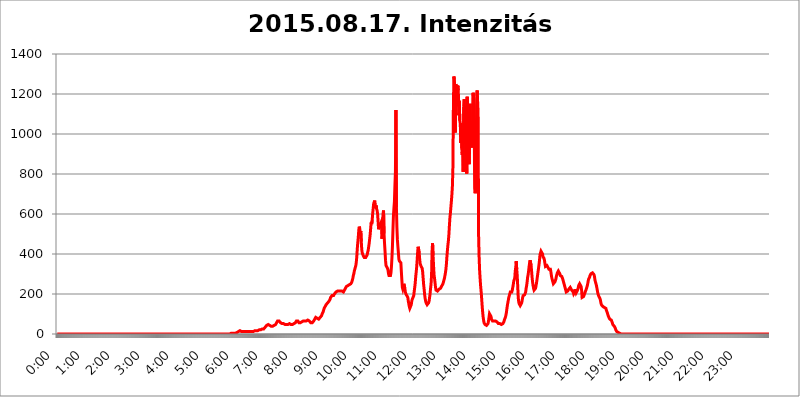
| Category | 2015.08.17. Intenzitás [W/m^2] |
|---|---|
| 0.0 | 0 |
| 0.0006944444444444445 | 0 |
| 0.001388888888888889 | 0 |
| 0.0020833333333333333 | 0 |
| 0.002777777777777778 | 0 |
| 0.003472222222222222 | 0 |
| 0.004166666666666667 | 0 |
| 0.004861111111111111 | 0 |
| 0.005555555555555556 | 0 |
| 0.0062499999999999995 | 0 |
| 0.006944444444444444 | 0 |
| 0.007638888888888889 | 0 |
| 0.008333333333333333 | 0 |
| 0.009027777777777779 | 0 |
| 0.009722222222222222 | 0 |
| 0.010416666666666666 | 0 |
| 0.011111111111111112 | 0 |
| 0.011805555555555555 | 0 |
| 0.012499999999999999 | 0 |
| 0.013194444444444444 | 0 |
| 0.013888888888888888 | 0 |
| 0.014583333333333332 | 0 |
| 0.015277777777777777 | 0 |
| 0.015972222222222224 | 0 |
| 0.016666666666666666 | 0 |
| 0.017361111111111112 | 0 |
| 0.018055555555555557 | 0 |
| 0.01875 | 0 |
| 0.019444444444444445 | 0 |
| 0.02013888888888889 | 0 |
| 0.020833333333333332 | 0 |
| 0.02152777777777778 | 0 |
| 0.022222222222222223 | 0 |
| 0.02291666666666667 | 0 |
| 0.02361111111111111 | 0 |
| 0.024305555555555556 | 0 |
| 0.024999999999999998 | 0 |
| 0.025694444444444447 | 0 |
| 0.02638888888888889 | 0 |
| 0.027083333333333334 | 0 |
| 0.027777777777777776 | 0 |
| 0.02847222222222222 | 0 |
| 0.029166666666666664 | 0 |
| 0.029861111111111113 | 0 |
| 0.030555555555555555 | 0 |
| 0.03125 | 0 |
| 0.03194444444444445 | 0 |
| 0.03263888888888889 | 0 |
| 0.03333333333333333 | 0 |
| 0.034027777777777775 | 0 |
| 0.034722222222222224 | 0 |
| 0.035416666666666666 | 0 |
| 0.036111111111111115 | 0 |
| 0.03680555555555556 | 0 |
| 0.0375 | 0 |
| 0.03819444444444444 | 0 |
| 0.03888888888888889 | 0 |
| 0.03958333333333333 | 0 |
| 0.04027777777777778 | 0 |
| 0.04097222222222222 | 0 |
| 0.041666666666666664 | 0 |
| 0.042361111111111106 | 0 |
| 0.04305555555555556 | 0 |
| 0.043750000000000004 | 0 |
| 0.044444444444444446 | 0 |
| 0.04513888888888889 | 0 |
| 0.04583333333333334 | 0 |
| 0.04652777777777778 | 0 |
| 0.04722222222222222 | 0 |
| 0.04791666666666666 | 0 |
| 0.04861111111111111 | 0 |
| 0.049305555555555554 | 0 |
| 0.049999999999999996 | 0 |
| 0.05069444444444445 | 0 |
| 0.051388888888888894 | 0 |
| 0.052083333333333336 | 0 |
| 0.05277777777777778 | 0 |
| 0.05347222222222222 | 0 |
| 0.05416666666666667 | 0 |
| 0.05486111111111111 | 0 |
| 0.05555555555555555 | 0 |
| 0.05625 | 0 |
| 0.05694444444444444 | 0 |
| 0.057638888888888885 | 0 |
| 0.05833333333333333 | 0 |
| 0.05902777777777778 | 0 |
| 0.059722222222222225 | 0 |
| 0.06041666666666667 | 0 |
| 0.061111111111111116 | 0 |
| 0.06180555555555556 | 0 |
| 0.0625 | 0 |
| 0.06319444444444444 | 0 |
| 0.06388888888888888 | 0 |
| 0.06458333333333334 | 0 |
| 0.06527777777777778 | 0 |
| 0.06597222222222222 | 0 |
| 0.06666666666666667 | 0 |
| 0.06736111111111111 | 0 |
| 0.06805555555555555 | 0 |
| 0.06874999999999999 | 0 |
| 0.06944444444444443 | 0 |
| 0.07013888888888889 | 0 |
| 0.07083333333333333 | 0 |
| 0.07152777777777779 | 0 |
| 0.07222222222222223 | 0 |
| 0.07291666666666667 | 0 |
| 0.07361111111111111 | 0 |
| 0.07430555555555556 | 0 |
| 0.075 | 0 |
| 0.07569444444444444 | 0 |
| 0.0763888888888889 | 0 |
| 0.07708333333333334 | 0 |
| 0.07777777777777778 | 0 |
| 0.07847222222222222 | 0 |
| 0.07916666666666666 | 0 |
| 0.0798611111111111 | 0 |
| 0.08055555555555556 | 0 |
| 0.08125 | 0 |
| 0.08194444444444444 | 0 |
| 0.08263888888888889 | 0 |
| 0.08333333333333333 | 0 |
| 0.08402777777777777 | 0 |
| 0.08472222222222221 | 0 |
| 0.08541666666666665 | 0 |
| 0.08611111111111112 | 0 |
| 0.08680555555555557 | 0 |
| 0.08750000000000001 | 0 |
| 0.08819444444444445 | 0 |
| 0.08888888888888889 | 0 |
| 0.08958333333333333 | 0 |
| 0.09027777777777778 | 0 |
| 0.09097222222222222 | 0 |
| 0.09166666666666667 | 0 |
| 0.09236111111111112 | 0 |
| 0.09305555555555556 | 0 |
| 0.09375 | 0 |
| 0.09444444444444444 | 0 |
| 0.09513888888888888 | 0 |
| 0.09583333333333333 | 0 |
| 0.09652777777777777 | 0 |
| 0.09722222222222222 | 0 |
| 0.09791666666666667 | 0 |
| 0.09861111111111111 | 0 |
| 0.09930555555555555 | 0 |
| 0.09999999999999999 | 0 |
| 0.10069444444444443 | 0 |
| 0.1013888888888889 | 0 |
| 0.10208333333333335 | 0 |
| 0.10277777777777779 | 0 |
| 0.10347222222222223 | 0 |
| 0.10416666666666667 | 0 |
| 0.10486111111111111 | 0 |
| 0.10555555555555556 | 0 |
| 0.10625 | 0 |
| 0.10694444444444444 | 0 |
| 0.1076388888888889 | 0 |
| 0.10833333333333334 | 0 |
| 0.10902777777777778 | 0 |
| 0.10972222222222222 | 0 |
| 0.1111111111111111 | 0 |
| 0.11180555555555556 | 0 |
| 0.11180555555555556 | 0 |
| 0.1125 | 0 |
| 0.11319444444444444 | 0 |
| 0.11388888888888889 | 0 |
| 0.11458333333333333 | 0 |
| 0.11527777777777777 | 0 |
| 0.11597222222222221 | 0 |
| 0.11666666666666665 | 0 |
| 0.1173611111111111 | 0 |
| 0.11805555555555557 | 0 |
| 0.11944444444444445 | 0 |
| 0.12013888888888889 | 0 |
| 0.12083333333333333 | 0 |
| 0.12152777777777778 | 0 |
| 0.12222222222222223 | 0 |
| 0.12291666666666667 | 0 |
| 0.12291666666666667 | 0 |
| 0.12361111111111112 | 0 |
| 0.12430555555555556 | 0 |
| 0.125 | 0 |
| 0.12569444444444444 | 0 |
| 0.12638888888888888 | 0 |
| 0.12708333333333333 | 0 |
| 0.16875 | 0 |
| 0.12847222222222224 | 0 |
| 0.12916666666666668 | 0 |
| 0.12986111111111112 | 0 |
| 0.13055555555555556 | 0 |
| 0.13125 | 0 |
| 0.13194444444444445 | 0 |
| 0.1326388888888889 | 0 |
| 0.13333333333333333 | 0 |
| 0.13402777777777777 | 0 |
| 0.13402777777777777 | 0 |
| 0.13472222222222222 | 0 |
| 0.13541666666666666 | 0 |
| 0.1361111111111111 | 0 |
| 0.13749999999999998 | 0 |
| 0.13819444444444443 | 0 |
| 0.1388888888888889 | 0 |
| 0.13958333333333334 | 0 |
| 0.14027777777777778 | 0 |
| 0.14097222222222222 | 0 |
| 0.14166666666666666 | 0 |
| 0.1423611111111111 | 0 |
| 0.14305555555555557 | 0 |
| 0.14375000000000002 | 0 |
| 0.14444444444444446 | 0 |
| 0.1451388888888889 | 0 |
| 0.1451388888888889 | 0 |
| 0.14652777777777778 | 0 |
| 0.14722222222222223 | 0 |
| 0.14791666666666667 | 0 |
| 0.1486111111111111 | 0 |
| 0.14930555555555555 | 0 |
| 0.15 | 0 |
| 0.15069444444444444 | 0 |
| 0.15138888888888888 | 0 |
| 0.15208333333333332 | 0 |
| 0.15277777777777776 | 0 |
| 0.15347222222222223 | 0 |
| 0.15416666666666667 | 0 |
| 0.15486111111111112 | 0 |
| 0.15555555555555556 | 0 |
| 0.15625 | 0 |
| 0.15694444444444444 | 0 |
| 0.15763888888888888 | 0 |
| 0.15833333333333333 | 0 |
| 0.15902777777777777 | 0 |
| 0.15972222222222224 | 0 |
| 0.16041666666666668 | 0 |
| 0.16111111111111112 | 0 |
| 0.16180555555555556 | 0 |
| 0.1625 | 0 |
| 0.16319444444444445 | 0 |
| 0.1638888888888889 | 0 |
| 0.16458333333333333 | 0 |
| 0.16527777777777777 | 0 |
| 0.16597222222222222 | 0 |
| 0.16666666666666666 | 0 |
| 0.1673611111111111 | 0 |
| 0.16805555555555554 | 0 |
| 0.16874999999999998 | 0 |
| 0.16944444444444443 | 0 |
| 0.17013888888888887 | 0 |
| 0.1708333333333333 | 0 |
| 0.17152777777777775 | 0 |
| 0.17222222222222225 | 0 |
| 0.1729166666666667 | 0 |
| 0.17361111111111113 | 0 |
| 0.17430555555555557 | 0 |
| 0.17500000000000002 | 0 |
| 0.17569444444444446 | 0 |
| 0.1763888888888889 | 0 |
| 0.17708333333333334 | 0 |
| 0.17777777777777778 | 0 |
| 0.17847222222222223 | 0 |
| 0.17916666666666667 | 0 |
| 0.1798611111111111 | 0 |
| 0.18055555555555555 | 0 |
| 0.18125 | 0 |
| 0.18194444444444444 | 0 |
| 0.1826388888888889 | 0 |
| 0.18333333333333335 | 0 |
| 0.1840277777777778 | 0 |
| 0.18472222222222223 | 0 |
| 0.18541666666666667 | 0 |
| 0.18611111111111112 | 0 |
| 0.18680555555555556 | 0 |
| 0.1875 | 0 |
| 0.18819444444444444 | 0 |
| 0.18888888888888888 | 0 |
| 0.18958333333333333 | 0 |
| 0.19027777777777777 | 0 |
| 0.1909722222222222 | 0 |
| 0.19166666666666665 | 0 |
| 0.19236111111111112 | 0 |
| 0.19305555555555554 | 0 |
| 0.19375 | 0 |
| 0.19444444444444445 | 0 |
| 0.1951388888888889 | 0 |
| 0.19583333333333333 | 0 |
| 0.19652777777777777 | 0 |
| 0.19722222222222222 | 0 |
| 0.19791666666666666 | 0 |
| 0.1986111111111111 | 0 |
| 0.19930555555555554 | 0 |
| 0.19999999999999998 | 0 |
| 0.20069444444444443 | 0 |
| 0.20138888888888887 | 0 |
| 0.2020833333333333 | 0 |
| 0.2027777777777778 | 0 |
| 0.2034722222222222 | 0 |
| 0.2041666666666667 | 0 |
| 0.20486111111111113 | 0 |
| 0.20555555555555557 | 0 |
| 0.20625000000000002 | 0 |
| 0.20694444444444446 | 0 |
| 0.2076388888888889 | 0 |
| 0.20833333333333334 | 0 |
| 0.20902777777777778 | 0 |
| 0.20972222222222223 | 0 |
| 0.21041666666666667 | 0 |
| 0.2111111111111111 | 0 |
| 0.21180555555555555 | 0 |
| 0.2125 | 0 |
| 0.21319444444444444 | 0 |
| 0.2138888888888889 | 0 |
| 0.21458333333333335 | 0 |
| 0.2152777777777778 | 0 |
| 0.21597222222222223 | 0 |
| 0.21666666666666667 | 0 |
| 0.21736111111111112 | 0 |
| 0.21805555555555556 | 0 |
| 0.21875 | 0 |
| 0.21944444444444444 | 0 |
| 0.22013888888888888 | 0 |
| 0.22083333333333333 | 0 |
| 0.22152777777777777 | 0 |
| 0.2222222222222222 | 0 |
| 0.22291666666666665 | 0 |
| 0.2236111111111111 | 0 |
| 0.22430555555555556 | 0 |
| 0.225 | 0 |
| 0.22569444444444445 | 0 |
| 0.2263888888888889 | 0 |
| 0.22708333333333333 | 0 |
| 0.22777777777777777 | 0 |
| 0.22847222222222222 | 0 |
| 0.22916666666666666 | 0 |
| 0.2298611111111111 | 0 |
| 0.23055555555555554 | 0 |
| 0.23124999999999998 | 0 |
| 0.23194444444444443 | 0 |
| 0.23263888888888887 | 0 |
| 0.2333333333333333 | 0 |
| 0.2340277777777778 | 0 |
| 0.2347222222222222 | 0 |
| 0.2354166666666667 | 0 |
| 0.23611111111111113 | 0 |
| 0.23680555555555557 | 0 |
| 0.23750000000000002 | 0 |
| 0.23819444444444446 | 0 |
| 0.2388888888888889 | 0 |
| 0.23958333333333334 | 0 |
| 0.24027777777777778 | 0 |
| 0.24097222222222223 | 0 |
| 0.24166666666666667 | 0 |
| 0.2423611111111111 | 3.525 |
| 0.24305555555555555 | 3.525 |
| 0.24375 | 3.525 |
| 0.24444444444444446 | 3.525 |
| 0.24513888888888888 | 3.525 |
| 0.24583333333333335 | 3.525 |
| 0.2465277777777778 | 3.525 |
| 0.24722222222222223 | 3.525 |
| 0.24791666666666667 | 3.525 |
| 0.24861111111111112 | 7.887 |
| 0.24930555555555556 | 3.525 |
| 0.25 | 3.525 |
| 0.25069444444444444 | 7.887 |
| 0.2513888888888889 | 7.887 |
| 0.2520833333333333 | 7.887 |
| 0.25277777777777777 | 12.257 |
| 0.2534722222222222 | 12.257 |
| 0.25416666666666665 | 12.257 |
| 0.2548611111111111 | 12.257 |
| 0.2555555555555556 | 16.636 |
| 0.25625000000000003 | 16.636 |
| 0.2569444444444445 | 16.636 |
| 0.2576388888888889 | 12.257 |
| 0.25833333333333336 | 12.257 |
| 0.2590277777777778 | 12.257 |
| 0.25972222222222224 | 12.257 |
| 0.2604166666666667 | 12.257 |
| 0.2611111111111111 | 12.257 |
| 0.26180555555555557 | 12.257 |
| 0.2625 | 12.257 |
| 0.26319444444444445 | 12.257 |
| 0.2638888888888889 | 12.257 |
| 0.26458333333333334 | 12.257 |
| 0.2652777777777778 | 12.257 |
| 0.2659722222222222 | 12.257 |
| 0.26666666666666666 | 12.257 |
| 0.2673611111111111 | 12.257 |
| 0.26805555555555555 | 12.257 |
| 0.26875 | 12.257 |
| 0.26944444444444443 | 12.257 |
| 0.2701388888888889 | 12.257 |
| 0.2708333333333333 | 12.257 |
| 0.27152777777777776 | 12.257 |
| 0.2722222222222222 | 12.257 |
| 0.27291666666666664 | 12.257 |
| 0.2736111111111111 | 12.257 |
| 0.2743055555555555 | 12.257 |
| 0.27499999999999997 | 12.257 |
| 0.27569444444444446 | 12.257 |
| 0.27638888888888885 | 12.257 |
| 0.27708333333333335 | 16.636 |
| 0.2777777777777778 | 16.636 |
| 0.27847222222222223 | 16.636 |
| 0.2791666666666667 | 16.636 |
| 0.2798611111111111 | 16.636 |
| 0.28055555555555556 | 16.636 |
| 0.28125 | 16.636 |
| 0.28194444444444444 | 16.636 |
| 0.2826388888888889 | 16.636 |
| 0.2833333333333333 | 21.024 |
| 0.28402777777777777 | 21.024 |
| 0.2847222222222222 | 21.024 |
| 0.28541666666666665 | 21.024 |
| 0.28611111111111115 | 21.024 |
| 0.28680555555555554 | 21.024 |
| 0.28750000000000003 | 25.419 |
| 0.2881944444444445 | 25.419 |
| 0.2888888888888889 | 25.419 |
| 0.28958333333333336 | 25.419 |
| 0.2902777777777778 | 29.823 |
| 0.29097222222222224 | 29.823 |
| 0.2916666666666667 | 34.234 |
| 0.2923611111111111 | 38.653 |
| 0.29305555555555557 | 38.653 |
| 0.29375 | 43.079 |
| 0.29444444444444445 | 43.079 |
| 0.2951388888888889 | 47.511 |
| 0.29583333333333334 | 47.511 |
| 0.2965277777777778 | 47.511 |
| 0.2972222222222222 | 43.079 |
| 0.29791666666666666 | 43.079 |
| 0.2986111111111111 | 43.079 |
| 0.29930555555555555 | 43.079 |
| 0.3 | 38.653 |
| 0.30069444444444443 | 38.653 |
| 0.3013888888888889 | 43.079 |
| 0.3020833333333333 | 38.653 |
| 0.30277777777777776 | 43.079 |
| 0.3034722222222222 | 43.079 |
| 0.30416666666666664 | 43.079 |
| 0.3048611111111111 | 43.079 |
| 0.3055555555555555 | 47.511 |
| 0.30624999999999997 | 47.511 |
| 0.3069444444444444 | 51.951 |
| 0.3076388888888889 | 56.398 |
| 0.30833333333333335 | 60.85 |
| 0.3090277777777778 | 65.31 |
| 0.30972222222222223 | 65.31 |
| 0.3104166666666667 | 65.31 |
| 0.3111111111111111 | 65.31 |
| 0.31180555555555556 | 65.31 |
| 0.3125 | 65.31 |
| 0.31319444444444444 | 56.398 |
| 0.3138888888888889 | 56.398 |
| 0.3145833333333333 | 56.398 |
| 0.31527777777777777 | 51.951 |
| 0.3159722222222222 | 51.951 |
| 0.31666666666666665 | 51.951 |
| 0.31736111111111115 | 51.951 |
| 0.31805555555555554 | 51.951 |
| 0.31875000000000003 | 47.511 |
| 0.3194444444444445 | 47.511 |
| 0.3201388888888889 | 47.511 |
| 0.32083333333333336 | 47.511 |
| 0.3215277777777778 | 47.511 |
| 0.32222222222222224 | 47.511 |
| 0.3229166666666667 | 47.511 |
| 0.3236111111111111 | 47.511 |
| 0.32430555555555557 | 47.511 |
| 0.325 | 47.511 |
| 0.32569444444444445 | 51.951 |
| 0.3263888888888889 | 47.511 |
| 0.32708333333333334 | 47.511 |
| 0.3277777777777778 | 47.511 |
| 0.3284722222222222 | 47.511 |
| 0.32916666666666666 | 47.511 |
| 0.3298611111111111 | 47.511 |
| 0.33055555555555555 | 47.511 |
| 0.33125 | 51.951 |
| 0.33194444444444443 | 51.951 |
| 0.3326388888888889 | 51.951 |
| 0.3333333333333333 | 56.398 |
| 0.3340277777777778 | 56.398 |
| 0.3347222222222222 | 60.85 |
| 0.3354166666666667 | 65.31 |
| 0.3361111111111111 | 65.31 |
| 0.3368055555555556 | 65.31 |
| 0.33749999999999997 | 65.31 |
| 0.33819444444444446 | 60.85 |
| 0.33888888888888885 | 56.398 |
| 0.33958333333333335 | 56.398 |
| 0.34027777777777773 | 51.951 |
| 0.34097222222222223 | 56.398 |
| 0.3416666666666666 | 56.398 |
| 0.3423611111111111 | 56.398 |
| 0.3430555555555555 | 60.85 |
| 0.34375 | 60.85 |
| 0.3444444444444445 | 65.31 |
| 0.3451388888888889 | 65.31 |
| 0.3458333333333334 | 65.31 |
| 0.34652777777777777 | 65.31 |
| 0.34722222222222227 | 65.31 |
| 0.34791666666666665 | 65.31 |
| 0.34861111111111115 | 65.31 |
| 0.34930555555555554 | 65.31 |
| 0.35000000000000003 | 69.775 |
| 0.3506944444444444 | 69.775 |
| 0.3513888888888889 | 69.775 |
| 0.3520833333333333 | 69.775 |
| 0.3527777777777778 | 65.31 |
| 0.3534722222222222 | 65.31 |
| 0.3541666666666667 | 65.31 |
| 0.3548611111111111 | 60.85 |
| 0.35555555555555557 | 56.398 |
| 0.35625 | 56.398 |
| 0.35694444444444445 | 56.398 |
| 0.3576388888888889 | 56.398 |
| 0.35833333333333334 | 56.398 |
| 0.3590277777777778 | 60.85 |
| 0.3597222222222222 | 65.31 |
| 0.36041666666666666 | 65.31 |
| 0.3611111111111111 | 74.246 |
| 0.36180555555555555 | 78.722 |
| 0.3625 | 83.205 |
| 0.36319444444444443 | 83.205 |
| 0.3638888888888889 | 78.722 |
| 0.3645833333333333 | 78.722 |
| 0.3652777777777778 | 74.246 |
| 0.3659722222222222 | 74.246 |
| 0.3666666666666667 | 74.246 |
| 0.3673611111111111 | 74.246 |
| 0.3680555555555556 | 78.722 |
| 0.36874999999999997 | 83.205 |
| 0.36944444444444446 | 87.692 |
| 0.37013888888888885 | 87.692 |
| 0.37083333333333335 | 92.184 |
| 0.37152777777777773 | 101.184 |
| 0.37222222222222223 | 105.69 |
| 0.3729166666666666 | 110.201 |
| 0.3736111111111111 | 119.235 |
| 0.3743055555555555 | 128.284 |
| 0.375 | 132.814 |
| 0.3756944444444445 | 137.347 |
| 0.3763888888888889 | 141.884 |
| 0.3770833333333334 | 146.423 |
| 0.37777777777777777 | 150.964 |
| 0.37847222222222227 | 150.964 |
| 0.37916666666666665 | 155.509 |
| 0.37986111111111115 | 155.509 |
| 0.38055555555555554 | 160.056 |
| 0.38125000000000003 | 164.605 |
| 0.3819444444444444 | 169.156 |
| 0.3826388888888889 | 173.709 |
| 0.3833333333333333 | 182.82 |
| 0.3840277777777778 | 182.82 |
| 0.3847222222222222 | 187.378 |
| 0.3854166666666667 | 191.937 |
| 0.3861111111111111 | 191.937 |
| 0.38680555555555557 | 191.937 |
| 0.3875 | 191.937 |
| 0.38819444444444445 | 196.497 |
| 0.3888888888888889 | 201.058 |
| 0.38958333333333334 | 201.058 |
| 0.3902777777777778 | 205.62 |
| 0.3909722222222222 | 210.182 |
| 0.39166666666666666 | 210.182 |
| 0.3923611111111111 | 214.746 |
| 0.39305555555555555 | 214.746 |
| 0.39375 | 219.309 |
| 0.39444444444444443 | 219.309 |
| 0.3951388888888889 | 214.746 |
| 0.3958333333333333 | 214.746 |
| 0.3965277777777778 | 214.746 |
| 0.3972222222222222 | 214.746 |
| 0.3979166666666667 | 214.746 |
| 0.3986111111111111 | 214.746 |
| 0.3993055555555556 | 214.746 |
| 0.39999999999999997 | 210.182 |
| 0.40069444444444446 | 210.182 |
| 0.40138888888888885 | 210.182 |
| 0.40208333333333335 | 214.746 |
| 0.40277777777777773 | 219.309 |
| 0.40347222222222223 | 223.873 |
| 0.4041666666666666 | 228.436 |
| 0.4048611111111111 | 233 |
| 0.4055555555555555 | 237.564 |
| 0.40625 | 242.127 |
| 0.4069444444444445 | 242.127 |
| 0.4076388888888889 | 242.127 |
| 0.4083333333333334 | 246.689 |
| 0.40902777777777777 | 246.689 |
| 0.40972222222222227 | 246.689 |
| 0.41041666666666665 | 246.689 |
| 0.41111111111111115 | 251.251 |
| 0.41180555555555554 | 251.251 |
| 0.41250000000000003 | 255.813 |
| 0.4131944444444444 | 260.373 |
| 0.4138888888888889 | 269.49 |
| 0.4145833333333333 | 278.603 |
| 0.4152777777777778 | 292.259 |
| 0.4159722222222222 | 301.354 |
| 0.4166666666666667 | 314.98 |
| 0.4173611111111111 | 324.052 |
| 0.41805555555555557 | 333.113 |
| 0.41875 | 342.162 |
| 0.41944444444444445 | 360.221 |
| 0.4201388888888889 | 387.202 |
| 0.42083333333333334 | 427.39 |
| 0.4215277777777778 | 458.38 |
| 0.4222222222222222 | 484.735 |
| 0.42291666666666666 | 519.555 |
| 0.4236111111111111 | 536.82 |
| 0.42430555555555555 | 528.2 |
| 0.425 | 497.836 |
| 0.42569444444444443 | 515.223 |
| 0.4263888888888889 | 462.786 |
| 0.4270833333333333 | 422.943 |
| 0.4277777777777778 | 405.108 |
| 0.4284722222222222 | 400.638 |
| 0.4291666666666667 | 391.685 |
| 0.4298611111111111 | 387.202 |
| 0.4305555555555556 | 382.715 |
| 0.43124999999999997 | 382.715 |
| 0.43194444444444446 | 378.224 |
| 0.43263888888888885 | 382.715 |
| 0.43333333333333335 | 382.715 |
| 0.43402777777777773 | 387.202 |
| 0.43472222222222223 | 396.164 |
| 0.4354166666666666 | 409.574 |
| 0.4361111111111111 | 418.492 |
| 0.4368055555555555 | 436.27 |
| 0.4375 | 453.968 |
| 0.4381944444444445 | 475.972 |
| 0.4388888888888889 | 497.836 |
| 0.4395833333333334 | 528.2 |
| 0.44027777777777777 | 558.261 |
| 0.44097222222222227 | 549.704 |
| 0.44166666666666665 | 566.793 |
| 0.44236111111111115 | 600.661 |
| 0.44305555555555554 | 625.784 |
| 0.44375000000000003 | 650.667 |
| 0.4444444444444444 | 650.667 |
| 0.4451388888888889 | 667.123 |
| 0.4458333333333333 | 642.4 |
| 0.4465277777777778 | 629.948 |
| 0.4472222222222222 | 642.4 |
| 0.4479166666666667 | 625.784 |
| 0.4486111111111111 | 617.436 |
| 0.44930555555555557 | 600.661 |
| 0.45 | 562.53 |
| 0.45069444444444445 | 523.88 |
| 0.4513888888888889 | 549.704 |
| 0.45208333333333334 | 541.121 |
| 0.4527777777777778 | 536.82 |
| 0.4534722222222222 | 545.416 |
| 0.45416666666666666 | 558.261 |
| 0.4548611111111111 | 541.121 |
| 0.45555555555555555 | 475.972 |
| 0.45625 | 558.261 |
| 0.45694444444444443 | 600.661 |
| 0.4576388888888889 | 617.436 |
| 0.4583333333333333 | 502.192 |
| 0.4590277777777778 | 453.968 |
| 0.4597222222222222 | 414.035 |
| 0.4604166666666667 | 369.23 |
| 0.4611111111111111 | 342.162 |
| 0.4618055555555556 | 342.162 |
| 0.46249999999999997 | 342.162 |
| 0.46319444444444446 | 328.584 |
| 0.46388888888888885 | 319.517 |
| 0.46458333333333335 | 301.354 |
| 0.46527777777777773 | 292.259 |
| 0.46597222222222223 | 287.709 |
| 0.4666666666666666 | 287.709 |
| 0.4673611111111111 | 292.259 |
| 0.4680555555555555 | 305.898 |
| 0.46875 | 337.639 |
| 0.4694444444444445 | 382.715 |
| 0.4701388888888889 | 440.702 |
| 0.4708333333333334 | 519.555 |
| 0.47152777777777777 | 592.233 |
| 0.47222222222222227 | 629.948 |
| 0.47291666666666665 | 663.019 |
| 0.47361111111111115 | 743.859 |
| 0.47430555555555554 | 810.641 |
| 0.47500000000000003 | 1120.238 |
| 0.4756944444444444 | 634.105 |
| 0.4763888888888889 | 532.513 |
| 0.4770833333333333 | 471.582 |
| 0.4777777777777778 | 436.27 |
| 0.4784722222222222 | 405.108 |
| 0.4791666666666667 | 373.729 |
| 0.4798611111111111 | 364.728 |
| 0.48055555555555557 | 369.23 |
| 0.48125 | 364.728 |
| 0.48194444444444445 | 355.712 |
| 0.4826388888888889 | 310.44 |
| 0.48333333333333334 | 269.49 |
| 0.4840277777777778 | 233 |
| 0.4847222222222222 | 223.873 |
| 0.48541666666666666 | 233 |
| 0.4861111111111111 | 251.251 |
| 0.48680555555555555 | 246.689 |
| 0.4875 | 228.436 |
| 0.48819444444444443 | 210.182 |
| 0.4888888888888889 | 201.058 |
| 0.4895833333333333 | 196.497 |
| 0.4902777777777778 | 191.937 |
| 0.4909722222222222 | 191.937 |
| 0.4916666666666667 | 182.82 |
| 0.4923611111111111 | 164.605 |
| 0.4930555555555556 | 150.964 |
| 0.49374999999999997 | 137.347 |
| 0.49444444444444446 | 128.284 |
| 0.49513888888888885 | 128.284 |
| 0.49583333333333335 | 132.814 |
| 0.49652777777777773 | 146.423 |
| 0.49722222222222223 | 164.605 |
| 0.4979166666666666 | 173.709 |
| 0.4986111111111111 | 173.709 |
| 0.4993055555555555 | 178.264 |
| 0.5 | 191.937 |
| 0.5006944444444444 | 214.746 |
| 0.5013888888888889 | 233 |
| 0.5020833333333333 | 255.813 |
| 0.5027777777777778 | 287.709 |
| 0.5034722222222222 | 310.44 |
| 0.5041666666666667 | 337.639 |
| 0.5048611111111111 | 373.729 |
| 0.5055555555555555 | 414.035 |
| 0.50625 | 436.27 |
| 0.5069444444444444 | 431.833 |
| 0.5076388888888889 | 405.108 |
| 0.5083333333333333 | 373.729 |
| 0.5090277777777777 | 351.198 |
| 0.5097222222222222 | 346.682 |
| 0.5104166666666666 | 337.639 |
| 0.5111111111111112 | 333.113 |
| 0.5118055555555555 | 328.584 |
| 0.5125000000000001 | 310.44 |
| 0.5131944444444444 | 278.603 |
| 0.513888888888889 | 246.689 |
| 0.5145833333333333 | 223.873 |
| 0.5152777777777778 | 196.497 |
| 0.5159722222222222 | 178.264 |
| 0.5166666666666667 | 164.605 |
| 0.517361111111111 | 155.509 |
| 0.5180555555555556 | 150.964 |
| 0.5187499999999999 | 146.423 |
| 0.5194444444444445 | 141.884 |
| 0.5201388888888888 | 146.423 |
| 0.5208333333333334 | 155.509 |
| 0.5215277777777778 | 164.605 |
| 0.5222222222222223 | 182.82 |
| 0.5229166666666667 | 201.058 |
| 0.5236111111111111 | 228.436 |
| 0.5243055555555556 | 251.251 |
| 0.525 | 296.808 |
| 0.5256944444444445 | 414.035 |
| 0.5263888888888889 | 453.968 |
| 0.5270833333333333 | 391.685 |
| 0.5277777777777778 | 342.162 |
| 0.5284722222222222 | 296.808 |
| 0.5291666666666667 | 278.603 |
| 0.5298611111111111 | 255.813 |
| 0.5305555555555556 | 233 |
| 0.53125 | 219.309 |
| 0.5319444444444444 | 219.309 |
| 0.5326388888888889 | 219.309 |
| 0.5333333333333333 | 214.746 |
| 0.5340277777777778 | 214.746 |
| 0.5347222222222222 | 219.309 |
| 0.5354166666666667 | 223.873 |
| 0.5361111111111111 | 223.873 |
| 0.5368055555555555 | 223.873 |
| 0.5375 | 228.436 |
| 0.5381944444444444 | 228.436 |
| 0.5388888888888889 | 233 |
| 0.5395833333333333 | 242.127 |
| 0.5402777777777777 | 246.689 |
| 0.5409722222222222 | 251.251 |
| 0.5416666666666666 | 255.813 |
| 0.5423611111111112 | 269.49 |
| 0.5430555555555555 | 278.603 |
| 0.5437500000000001 | 292.259 |
| 0.5444444444444444 | 305.898 |
| 0.545138888888889 | 324.052 |
| 0.5458333333333333 | 351.198 |
| 0.5465277777777778 | 387.202 |
| 0.5472222222222222 | 418.492 |
| 0.5479166666666667 | 445.129 |
| 0.548611111111111 | 467.187 |
| 0.5493055555555556 | 497.836 |
| 0.5499999999999999 | 541.121 |
| 0.5506944444444445 | 579.542 |
| 0.5513888888888888 | 604.864 |
| 0.5520833333333334 | 634.105 |
| 0.5527777777777778 | 663.019 |
| 0.5534722222222223 | 695.666 |
| 0.5541666666666667 | 735.89 |
| 0.5548611111111111 | 818.392 |
| 0.5555555555555556 | 1112.618 |
| 0.55625 | 1287.761 |
| 0.5569444444444445 | 1275.142 |
| 0.5576388888888889 | 1213.804 |
| 0.5583333333333333 | 1007.383 |
| 0.5590277777777778 | 1250.275 |
| 0.5597222222222222 | 1209.807 |
| 0.5604166666666667 | 1197.876 |
| 0.5611111111111111 | 1201.843 |
| 0.5618055555555556 | 1242.089 |
| 0.5625 | 1217.812 |
| 0.5631944444444444 | 1093.653 |
| 0.5638888888888889 | 1166.46 |
| 0.5645833333333333 | 1067.267 |
| 0.5652777777777778 | 1052.255 |
| 0.5659722222222222 | 955.071 |
| 0.5666666666666667 | 1052.255 |
| 0.5673611111111111 | 928.819 |
| 0.5680555555555555 | 894.885 |
| 0.56875 | 966.295 |
| 0.5694444444444444 | 810.641 |
| 0.5701388888888889 | 1135.543 |
| 0.5708333333333333 | 1174.263 |
| 0.5715277777777777 | 1041.019 |
| 0.5722222222222222 | 1014.852 |
| 0.5729166666666666 | 955.071 |
| 0.5736111111111112 | 1022.323 |
| 0.5743055555555555 | 802.868 |
| 0.5750000000000001 | 1186.03 |
| 0.5756944444444444 | 1186.03 |
| 0.576388888888889 | 898.668 |
| 0.5770833333333333 | 887.309 |
| 0.5777777777777778 | 849.199 |
| 0.5784722222222222 | 992.448 |
| 0.5791666666666667 | 1150.946 |
| 0.579861111111111 | 947.58 |
| 0.5805555555555556 | 973.772 |
| 0.5812499999999999 | 932.576 |
| 0.5819444444444445 | 1067.267 |
| 0.5826388888888888 | 1026.06 |
| 0.5833333333333334 | 1205.82 |
| 0.5840277777777778 | 1170.358 |
| 0.5847222222222223 | 1143.232 |
| 0.5854166666666667 | 727.896 |
| 0.5861111111111111 | 703.762 |
| 0.5868055555555556 | 719.877 |
| 0.5875 | 739.877 |
| 0.5881944444444445 | 1178.177 |
| 0.5888888888888889 | 1217.812 |
| 0.5895833333333333 | 1162.571 |
| 0.5902777777777778 | 1101.226 |
| 0.5909722222222222 | 489.108 |
| 0.5916666666666667 | 387.202 |
| 0.5923611111111111 | 319.517 |
| 0.5930555555555556 | 278.603 |
| 0.59375 | 242.127 |
| 0.5944444444444444 | 214.746 |
| 0.5951388888888889 | 182.82 |
| 0.5958333333333333 | 146.423 |
| 0.5965277777777778 | 114.716 |
| 0.5972222222222222 | 87.692 |
| 0.5979166666666667 | 69.775 |
| 0.5986111111111111 | 56.398 |
| 0.5993055555555555 | 51.951 |
| 0.6 | 47.511 |
| 0.6006944444444444 | 47.511 |
| 0.6013888888888889 | 43.079 |
| 0.6020833333333333 | 43.079 |
| 0.6027777777777777 | 43.079 |
| 0.6034722222222222 | 47.511 |
| 0.6041666666666666 | 51.951 |
| 0.6048611111111112 | 65.31 |
| 0.6055555555555555 | 83.205 |
| 0.6062500000000001 | 101.184 |
| 0.6069444444444444 | 105.69 |
| 0.607638888888889 | 101.184 |
| 0.6083333333333333 | 87.692 |
| 0.6090277777777778 | 74.246 |
| 0.6097222222222222 | 69.775 |
| 0.6104166666666667 | 65.31 |
| 0.611111111111111 | 65.31 |
| 0.6118055555555556 | 69.775 |
| 0.6124999999999999 | 65.31 |
| 0.6131944444444445 | 65.31 |
| 0.6138888888888888 | 65.31 |
| 0.6145833333333334 | 65.31 |
| 0.6152777777777778 | 65.31 |
| 0.6159722222222223 | 65.31 |
| 0.6166666666666667 | 60.85 |
| 0.6173611111111111 | 56.398 |
| 0.6180555555555556 | 56.398 |
| 0.61875 | 51.951 |
| 0.6194444444444445 | 51.951 |
| 0.6201388888888889 | 51.951 |
| 0.6208333333333333 | 51.951 |
| 0.6215277777777778 | 47.511 |
| 0.6222222222222222 | 47.511 |
| 0.6229166666666667 | 47.511 |
| 0.6236111111111111 | 47.511 |
| 0.6243055555555556 | 47.511 |
| 0.625 | 51.951 |
| 0.6256944444444444 | 56.398 |
| 0.6263888888888889 | 60.85 |
| 0.6270833333333333 | 69.775 |
| 0.6277777777777778 | 74.246 |
| 0.6284722222222222 | 83.205 |
| 0.6291666666666667 | 92.184 |
| 0.6298611111111111 | 105.69 |
| 0.6305555555555555 | 123.758 |
| 0.63125 | 141.884 |
| 0.6319444444444444 | 155.509 |
| 0.6326388888888889 | 169.156 |
| 0.6333333333333333 | 182.82 |
| 0.6340277777777777 | 191.937 |
| 0.6347222222222222 | 201.058 |
| 0.6354166666666666 | 210.182 |
| 0.6361111111111112 | 210.182 |
| 0.6368055555555555 | 210.182 |
| 0.6375000000000001 | 210.182 |
| 0.6381944444444444 | 219.309 |
| 0.638888888888889 | 233 |
| 0.6395833333333333 | 246.689 |
| 0.6402777777777778 | 264.932 |
| 0.6409722222222222 | 269.49 |
| 0.6416666666666667 | 278.603 |
| 0.642361111111111 | 314.98 |
| 0.6430555555555556 | 333.113 |
| 0.6437499999999999 | 364.728 |
| 0.6444444444444445 | 324.052 |
| 0.6451388888888888 | 292.259 |
| 0.6458333333333334 | 237.564 |
| 0.6465277777777778 | 182.82 |
| 0.6472222222222223 | 160.056 |
| 0.6479166666666667 | 150.964 |
| 0.6486111111111111 | 146.423 |
| 0.6493055555555556 | 141.884 |
| 0.65 | 141.884 |
| 0.6506944444444445 | 146.423 |
| 0.6513888888888889 | 155.509 |
| 0.6520833333333333 | 169.156 |
| 0.6527777777777778 | 182.82 |
| 0.6534722222222222 | 191.937 |
| 0.6541666666666667 | 196.497 |
| 0.6548611111111111 | 196.497 |
| 0.6555555555555556 | 196.497 |
| 0.65625 | 201.058 |
| 0.6569444444444444 | 210.182 |
| 0.6576388888888889 | 228.436 |
| 0.6583333333333333 | 242.127 |
| 0.6590277777777778 | 260.373 |
| 0.6597222222222222 | 283.156 |
| 0.6604166666666667 | 296.808 |
| 0.6611111111111111 | 314.98 |
| 0.6618055555555555 | 337.639 |
| 0.6625 | 355.712 |
| 0.6631944444444444 | 369.23 |
| 0.6638888888888889 | 364.728 |
| 0.6645833333333333 | 342.162 |
| 0.6652777777777777 | 314.98 |
| 0.6659722222222222 | 283.156 |
| 0.6666666666666666 | 260.373 |
| 0.6673611111111111 | 242.127 |
| 0.6680555555555556 | 228.436 |
| 0.6687500000000001 | 219.309 |
| 0.6694444444444444 | 214.746 |
| 0.6701388888888888 | 219.309 |
| 0.6708333333333334 | 228.436 |
| 0.6715277777777778 | 242.127 |
| 0.6722222222222222 | 255.813 |
| 0.6729166666666666 | 274.047 |
| 0.6736111111111112 | 292.259 |
| 0.6743055555555556 | 310.44 |
| 0.6749999999999999 | 328.584 |
| 0.6756944444444444 | 346.682 |
| 0.6763888888888889 | 369.23 |
| 0.6770833333333334 | 396.164 |
| 0.6777777777777777 | 405.108 |
| 0.6784722222222223 | 414.035 |
| 0.6791666666666667 | 418.492 |
| 0.6798611111111111 | 414.035 |
| 0.6805555555555555 | 400.638 |
| 0.68125 | 387.202 |
| 0.6819444444444445 | 387.202 |
| 0.6826388888888889 | 378.224 |
| 0.6833333333333332 | 369.23 |
| 0.6840277777777778 | 351.198 |
| 0.6847222222222222 | 337.639 |
| 0.6854166666666667 | 333.113 |
| 0.686111111111111 | 337.639 |
| 0.6868055555555556 | 342.162 |
| 0.6875 | 337.639 |
| 0.6881944444444444 | 333.113 |
| 0.688888888888889 | 328.584 |
| 0.6895833333333333 | 324.052 |
| 0.6902777777777778 | 324.052 |
| 0.6909722222222222 | 324.052 |
| 0.6916666666666668 | 324.052 |
| 0.6923611111111111 | 310.44 |
| 0.6930555555555555 | 292.259 |
| 0.69375 | 278.603 |
| 0.6944444444444445 | 269.49 |
| 0.6951388888888889 | 274.047 |
| 0.6958333333333333 | 251.251 |
| 0.6965277777777777 | 251.251 |
| 0.6972222222222223 | 251.251 |
| 0.6979166666666666 | 260.373 |
| 0.6986111111111111 | 264.932 |
| 0.6993055555555556 | 274.047 |
| 0.7000000000000001 | 287.709 |
| 0.7006944444444444 | 296.808 |
| 0.7013888888888888 | 305.898 |
| 0.7020833333333334 | 310.44 |
| 0.7027777777777778 | 314.98 |
| 0.7034722222222222 | 314.98 |
| 0.7041666666666666 | 310.44 |
| 0.7048611111111112 | 301.354 |
| 0.7055555555555556 | 292.259 |
| 0.7062499999999999 | 292.259 |
| 0.7069444444444444 | 287.709 |
| 0.7076388888888889 | 287.709 |
| 0.7083333333333334 | 283.156 |
| 0.7090277777777777 | 274.047 |
| 0.7097222222222223 | 264.932 |
| 0.7104166666666667 | 255.813 |
| 0.7111111111111111 | 246.689 |
| 0.7118055555555555 | 237.564 |
| 0.7125 | 228.436 |
| 0.7131944444444445 | 219.309 |
| 0.7138888888888889 | 210.182 |
| 0.7145833333333332 | 210.182 |
| 0.7152777777777778 | 210.182 |
| 0.7159722222222222 | 214.746 |
| 0.7166666666666667 | 219.309 |
| 0.717361111111111 | 223.873 |
| 0.7180555555555556 | 223.873 |
| 0.71875 | 223.873 |
| 0.7194444444444444 | 233 |
| 0.720138888888889 | 228.436 |
| 0.7208333333333333 | 228.436 |
| 0.7215277777777778 | 219.309 |
| 0.7222222222222222 | 219.309 |
| 0.7229166666666668 | 219.309 |
| 0.7236111111111111 | 210.182 |
| 0.7243055555555555 | 201.058 |
| 0.725 | 205.62 |
| 0.7256944444444445 | 210.182 |
| 0.7263888888888889 | 223.873 |
| 0.7270833333333333 | 214.746 |
| 0.7277777777777777 | 205.62 |
| 0.7284722222222223 | 210.182 |
| 0.7291666666666666 | 214.746 |
| 0.7298611111111111 | 219.309 |
| 0.7305555555555556 | 228.436 |
| 0.7312500000000001 | 242.127 |
| 0.7319444444444444 | 246.689 |
| 0.7326388888888888 | 251.251 |
| 0.7333333333333334 | 251.251 |
| 0.7340277777777778 | 246.689 |
| 0.7347222222222222 | 237.564 |
| 0.7354166666666666 | 219.309 |
| 0.7361111111111112 | 182.82 |
| 0.7368055555555556 | 178.264 |
| 0.7374999999999999 | 178.264 |
| 0.7381944444444444 | 187.378 |
| 0.7388888888888889 | 191.937 |
| 0.7395833333333334 | 201.058 |
| 0.7402777777777777 | 205.62 |
| 0.7409722222222223 | 214.746 |
| 0.7416666666666667 | 219.309 |
| 0.7423611111111111 | 228.436 |
| 0.7430555555555555 | 237.564 |
| 0.74375 | 246.689 |
| 0.7444444444444445 | 260.373 |
| 0.7451388888888889 | 274.047 |
| 0.7458333333333332 | 278.603 |
| 0.7465277777777778 | 283.156 |
| 0.7472222222222222 | 292.259 |
| 0.7479166666666667 | 296.808 |
| 0.748611111111111 | 301.354 |
| 0.7493055555555556 | 301.354 |
| 0.75 | 301.354 |
| 0.7506944444444444 | 305.898 |
| 0.751388888888889 | 301.354 |
| 0.7520833333333333 | 305.898 |
| 0.7527777777777778 | 296.808 |
| 0.7534722222222222 | 287.709 |
| 0.7541666666666668 | 269.49 |
| 0.7548611111111111 | 260.373 |
| 0.7555555555555555 | 251.251 |
| 0.75625 | 242.127 |
| 0.7569444444444445 | 228.436 |
| 0.7576388888888889 | 214.746 |
| 0.7583333333333333 | 201.058 |
| 0.7590277777777777 | 196.497 |
| 0.7597222222222223 | 187.378 |
| 0.7604166666666666 | 182.82 |
| 0.7611111111111111 | 178.264 |
| 0.7618055555555556 | 169.156 |
| 0.7625000000000001 | 155.509 |
| 0.7631944444444444 | 146.423 |
| 0.7638888888888888 | 141.884 |
| 0.7645833333333334 | 141.884 |
| 0.7652777777777778 | 137.347 |
| 0.7659722222222222 | 137.347 |
| 0.7666666666666666 | 132.814 |
| 0.7673611111111112 | 132.814 |
| 0.7680555555555556 | 132.814 |
| 0.7687499999999999 | 132.814 |
| 0.7694444444444444 | 128.284 |
| 0.7701388888888889 | 119.235 |
| 0.7708333333333334 | 114.716 |
| 0.7715277777777777 | 105.69 |
| 0.7722222222222223 | 96.682 |
| 0.7729166666666667 | 92.184 |
| 0.7736111111111111 | 83.205 |
| 0.7743055555555555 | 78.722 |
| 0.775 | 74.246 |
| 0.7756944444444445 | 74.246 |
| 0.7763888888888889 | 74.246 |
| 0.7770833333333332 | 69.775 |
| 0.7777777777777778 | 65.31 |
| 0.7784722222222222 | 56.398 |
| 0.7791666666666667 | 47.511 |
| 0.779861111111111 | 43.079 |
| 0.7805555555555556 | 43.079 |
| 0.78125 | 38.653 |
| 0.7819444444444444 | 38.653 |
| 0.782638888888889 | 29.823 |
| 0.7833333333333333 | 21.024 |
| 0.7840277777777778 | 16.636 |
| 0.7847222222222222 | 12.257 |
| 0.7854166666666668 | 12.257 |
| 0.7861111111111111 | 12.257 |
| 0.7868055555555555 | 7.887 |
| 0.7875 | 3.525 |
| 0.7881944444444445 | 3.525 |
| 0.7888888888888889 | 3.525 |
| 0.7895833333333333 | 0 |
| 0.7902777777777777 | 0 |
| 0.7909722222222223 | 0 |
| 0.7916666666666666 | 0 |
| 0.7923611111111111 | 0 |
| 0.7930555555555556 | 0 |
| 0.7937500000000001 | 0 |
| 0.7944444444444444 | 0 |
| 0.7951388888888888 | 0 |
| 0.7958333333333334 | 0 |
| 0.7965277777777778 | 0 |
| 0.7972222222222222 | 0 |
| 0.7979166666666666 | 0 |
| 0.7986111111111112 | 0 |
| 0.7993055555555556 | 0 |
| 0.7999999999999999 | 0 |
| 0.8006944444444444 | 0 |
| 0.8013888888888889 | 0 |
| 0.8020833333333334 | 0 |
| 0.8027777777777777 | 0 |
| 0.8034722222222223 | 0 |
| 0.8041666666666667 | 0 |
| 0.8048611111111111 | 0 |
| 0.8055555555555555 | 0 |
| 0.80625 | 0 |
| 0.8069444444444445 | 0 |
| 0.8076388888888889 | 0 |
| 0.8083333333333332 | 0 |
| 0.8090277777777778 | 0 |
| 0.8097222222222222 | 0 |
| 0.8104166666666667 | 0 |
| 0.811111111111111 | 0 |
| 0.8118055555555556 | 0 |
| 0.8125 | 0 |
| 0.8131944444444444 | 0 |
| 0.813888888888889 | 0 |
| 0.8145833333333333 | 0 |
| 0.8152777777777778 | 0 |
| 0.8159722222222222 | 0 |
| 0.8166666666666668 | 0 |
| 0.8173611111111111 | 0 |
| 0.8180555555555555 | 0 |
| 0.81875 | 0 |
| 0.8194444444444445 | 0 |
| 0.8201388888888889 | 0 |
| 0.8208333333333333 | 0 |
| 0.8215277777777777 | 0 |
| 0.8222222222222223 | 0 |
| 0.8229166666666666 | 0 |
| 0.8236111111111111 | 0 |
| 0.8243055555555556 | 0 |
| 0.8250000000000001 | 0 |
| 0.8256944444444444 | 0 |
| 0.8263888888888888 | 0 |
| 0.8270833333333334 | 0 |
| 0.8277777777777778 | 0 |
| 0.8284722222222222 | 0 |
| 0.8291666666666666 | 0 |
| 0.8298611111111112 | 0 |
| 0.8305555555555556 | 0 |
| 0.8312499999999999 | 0 |
| 0.8319444444444444 | 0 |
| 0.8326388888888889 | 0 |
| 0.8333333333333334 | 0 |
| 0.8340277777777777 | 0 |
| 0.8347222222222223 | 0 |
| 0.8354166666666667 | 0 |
| 0.8361111111111111 | 0 |
| 0.8368055555555555 | 0 |
| 0.8375 | 0 |
| 0.8381944444444445 | 0 |
| 0.8388888888888889 | 0 |
| 0.8395833333333332 | 0 |
| 0.8402777777777778 | 0 |
| 0.8409722222222222 | 0 |
| 0.8416666666666667 | 0 |
| 0.842361111111111 | 0 |
| 0.8430555555555556 | 0 |
| 0.84375 | 0 |
| 0.8444444444444444 | 0 |
| 0.845138888888889 | 0 |
| 0.8458333333333333 | 0 |
| 0.8465277777777778 | 0 |
| 0.8472222222222222 | 0 |
| 0.8479166666666668 | 0 |
| 0.8486111111111111 | 0 |
| 0.8493055555555555 | 0 |
| 0.85 | 0 |
| 0.8506944444444445 | 0 |
| 0.8513888888888889 | 0 |
| 0.8520833333333333 | 0 |
| 0.8527777777777777 | 0 |
| 0.8534722222222223 | 0 |
| 0.8541666666666666 | 0 |
| 0.8548611111111111 | 0 |
| 0.8555555555555556 | 0 |
| 0.8562500000000001 | 0 |
| 0.8569444444444444 | 0 |
| 0.8576388888888888 | 0 |
| 0.8583333333333334 | 0 |
| 0.8590277777777778 | 0 |
| 0.8597222222222222 | 0 |
| 0.8604166666666666 | 0 |
| 0.8611111111111112 | 0 |
| 0.8618055555555556 | 0 |
| 0.8624999999999999 | 0 |
| 0.8631944444444444 | 0 |
| 0.8638888888888889 | 0 |
| 0.8645833333333334 | 0 |
| 0.8652777777777777 | 0 |
| 0.8659722222222223 | 0 |
| 0.8666666666666667 | 0 |
| 0.8673611111111111 | 0 |
| 0.8680555555555555 | 0 |
| 0.86875 | 0 |
| 0.8694444444444445 | 0 |
| 0.8701388888888889 | 0 |
| 0.8708333333333332 | 0 |
| 0.8715277777777778 | 0 |
| 0.8722222222222222 | 0 |
| 0.8729166666666667 | 0 |
| 0.873611111111111 | 0 |
| 0.8743055555555556 | 0 |
| 0.875 | 0 |
| 0.8756944444444444 | 0 |
| 0.876388888888889 | 0 |
| 0.8770833333333333 | 0 |
| 0.8777777777777778 | 0 |
| 0.8784722222222222 | 0 |
| 0.8791666666666668 | 0 |
| 0.8798611111111111 | 0 |
| 0.8805555555555555 | 0 |
| 0.88125 | 0 |
| 0.8819444444444445 | 0 |
| 0.8826388888888889 | 0 |
| 0.8833333333333333 | 0 |
| 0.8840277777777777 | 0 |
| 0.8847222222222223 | 0 |
| 0.8854166666666666 | 0 |
| 0.8861111111111111 | 0 |
| 0.8868055555555556 | 0 |
| 0.8875000000000001 | 0 |
| 0.8881944444444444 | 0 |
| 0.8888888888888888 | 0 |
| 0.8895833333333334 | 0 |
| 0.8902777777777778 | 0 |
| 0.8909722222222222 | 0 |
| 0.8916666666666666 | 0 |
| 0.8923611111111112 | 0 |
| 0.8930555555555556 | 0 |
| 0.8937499999999999 | 0 |
| 0.8944444444444444 | 0 |
| 0.8951388888888889 | 0 |
| 0.8958333333333334 | 0 |
| 0.8965277777777777 | 0 |
| 0.8972222222222223 | 0 |
| 0.8979166666666667 | 0 |
| 0.8986111111111111 | 0 |
| 0.8993055555555555 | 0 |
| 0.9 | 0 |
| 0.9006944444444445 | 0 |
| 0.9013888888888889 | 0 |
| 0.9020833333333332 | 0 |
| 0.9027777777777778 | 0 |
| 0.9034722222222222 | 0 |
| 0.9041666666666667 | 0 |
| 0.904861111111111 | 0 |
| 0.9055555555555556 | 0 |
| 0.90625 | 0 |
| 0.9069444444444444 | 0 |
| 0.907638888888889 | 0 |
| 0.9083333333333333 | 0 |
| 0.9090277777777778 | 0 |
| 0.9097222222222222 | 0 |
| 0.9104166666666668 | 0 |
| 0.9111111111111111 | 0 |
| 0.9118055555555555 | 0 |
| 0.9125 | 0 |
| 0.9131944444444445 | 0 |
| 0.9138888888888889 | 0 |
| 0.9145833333333333 | 0 |
| 0.9152777777777777 | 0 |
| 0.9159722222222223 | 0 |
| 0.9166666666666666 | 0 |
| 0.9173611111111111 | 0 |
| 0.9180555555555556 | 0 |
| 0.9187500000000001 | 0 |
| 0.9194444444444444 | 0 |
| 0.9201388888888888 | 0 |
| 0.9208333333333334 | 0 |
| 0.9215277777777778 | 0 |
| 0.9222222222222222 | 0 |
| 0.9229166666666666 | 0 |
| 0.9236111111111112 | 0 |
| 0.9243055555555556 | 0 |
| 0.9249999999999999 | 0 |
| 0.9256944444444444 | 0 |
| 0.9263888888888889 | 0 |
| 0.9270833333333334 | 0 |
| 0.9277777777777777 | 0 |
| 0.9284722222222223 | 0 |
| 0.9291666666666667 | 0 |
| 0.9298611111111111 | 0 |
| 0.9305555555555555 | 0 |
| 0.93125 | 0 |
| 0.9319444444444445 | 0 |
| 0.9326388888888889 | 0 |
| 0.9333333333333332 | 0 |
| 0.9340277777777778 | 0 |
| 0.9347222222222222 | 0 |
| 0.9354166666666667 | 0 |
| 0.936111111111111 | 0 |
| 0.9368055555555556 | 0 |
| 0.9375 | 0 |
| 0.9381944444444444 | 0 |
| 0.938888888888889 | 0 |
| 0.9395833333333333 | 0 |
| 0.9402777777777778 | 0 |
| 0.9409722222222222 | 0 |
| 0.9416666666666668 | 0 |
| 0.9423611111111111 | 0 |
| 0.9430555555555555 | 0 |
| 0.94375 | 0 |
| 0.9444444444444445 | 0 |
| 0.9451388888888889 | 0 |
| 0.9458333333333333 | 0 |
| 0.9465277777777777 | 0 |
| 0.9472222222222223 | 0 |
| 0.9479166666666666 | 0 |
| 0.9486111111111111 | 0 |
| 0.9493055555555556 | 0 |
| 0.9500000000000001 | 0 |
| 0.9506944444444444 | 0 |
| 0.9513888888888888 | 0 |
| 0.9520833333333334 | 0 |
| 0.9527777777777778 | 0 |
| 0.9534722222222222 | 0 |
| 0.9541666666666666 | 0 |
| 0.9548611111111112 | 0 |
| 0.9555555555555556 | 0 |
| 0.9562499999999999 | 0 |
| 0.9569444444444444 | 0 |
| 0.9576388888888889 | 0 |
| 0.9583333333333334 | 0 |
| 0.9590277777777777 | 0 |
| 0.9597222222222223 | 0 |
| 0.9604166666666667 | 0 |
| 0.9611111111111111 | 0 |
| 0.9618055555555555 | 0 |
| 0.9625 | 0 |
| 0.9631944444444445 | 0 |
| 0.9638888888888889 | 0 |
| 0.9645833333333332 | 0 |
| 0.9652777777777778 | 0 |
| 0.9659722222222222 | 0 |
| 0.9666666666666667 | 0 |
| 0.967361111111111 | 0 |
| 0.9680555555555556 | 0 |
| 0.96875 | 0 |
| 0.9694444444444444 | 0 |
| 0.970138888888889 | 0 |
| 0.9708333333333333 | 0 |
| 0.9715277777777778 | 0 |
| 0.9722222222222222 | 0 |
| 0.9729166666666668 | 0 |
| 0.9736111111111111 | 0 |
| 0.9743055555555555 | 0 |
| 0.975 | 0 |
| 0.9756944444444445 | 0 |
| 0.9763888888888889 | 0 |
| 0.9770833333333333 | 0 |
| 0.9777777777777777 | 0 |
| 0.9784722222222223 | 0 |
| 0.9791666666666666 | 0 |
| 0.9798611111111111 | 0 |
| 0.9805555555555556 | 0 |
| 0.9812500000000001 | 0 |
| 0.9819444444444444 | 0 |
| 0.9826388888888888 | 0 |
| 0.9833333333333334 | 0 |
| 0.9840277777777778 | 0 |
| 0.9847222222222222 | 0 |
| 0.9854166666666666 | 0 |
| 0.9861111111111112 | 0 |
| 0.9868055555555556 | 0 |
| 0.9874999999999999 | 0 |
| 0.9881944444444444 | 0 |
| 0.9888888888888889 | 0 |
| 0.9895833333333334 | 0 |
| 0.9902777777777777 | 0 |
| 0.9909722222222223 | 0 |
| 0.9916666666666667 | 0 |
| 0.9923611111111111 | 0 |
| 0.9930555555555555 | 0 |
| 0.99375 | 0 |
| 0.9944444444444445 | 0 |
| 0.9951388888888889 | 0 |
| 0.9958333333333332 | 0 |
| 0.9965277777777778 | 0 |
| 0.9972222222222222 | 0 |
| 0.9979166666666667 | 0 |
| 0.998611111111111 | 0 |
| 0.9993055555555556 | 0 |